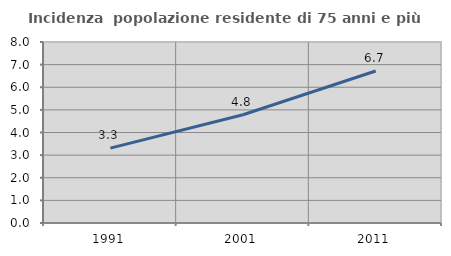
| Category | Incidenza  popolazione residente di 75 anni e più |
|---|---|
| 1991.0 | 3.308 |
| 2001.0 | 4.784 |
| 2011.0 | 6.717 |